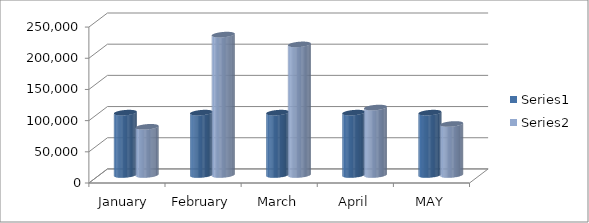
| Category | Series 0 | Series 1 |
|---|---|---|
| January  | 100000 | 77272 |
| February | 100000 | 225090 |
| March | 100000 | 209400 |
| April | 100000 | 108135 |
| MAY | 100000 | 81810 |